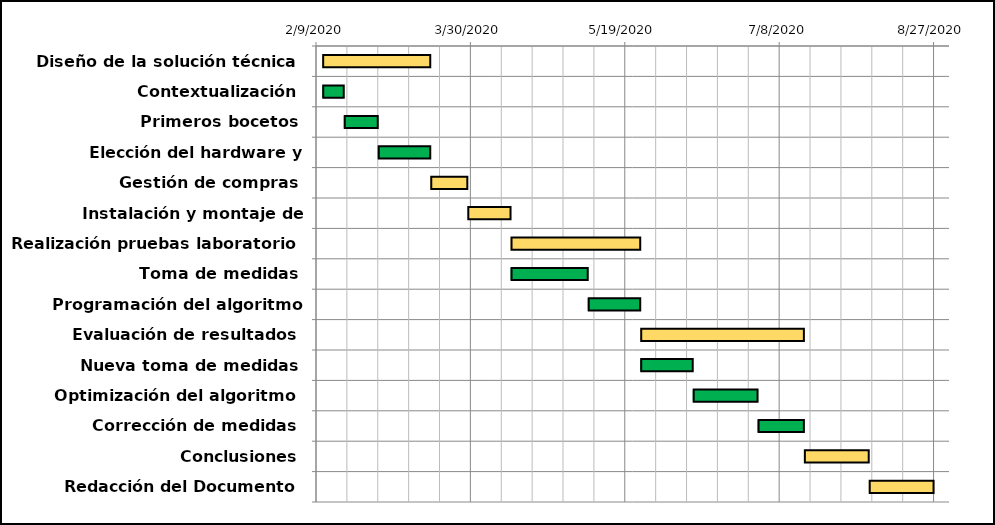
| Category | Fecha de Inicio | Duración |
|---|---|---|
| Diseño de la solución técnica | 2/11/20 | 35 |
| Contextualización | 2/11/20 | 7 |
| Primeros bocetos | 2/18/20 | 11 |
| Elección del hardware y elementos | 2/29/20 | 17 |
| Gestión de compras | 3/17/20 | 12 |
| Instalación y montaje de elementos | 3/29/20 | 14 |
| Realización pruebas laboratorio | 4/12/20 | 42 |
| Toma de medidas | 4/12/20 | 25 |
| Programación del algoritmo software | 5/7/20 | 17 |
| Evaluación de resultados | 5/24/20 | 53 |
| Nueva toma de medidas | 5/24/20 | 17 |
| Optimización del algoritmo | 6/10/20 | 21 |
| Corrección de medidas | 7/1/20 | 15 |
| Conclusiones | 7/16/20 | 21 |
| Redacción del Documento | 8/6/20 | 21 |